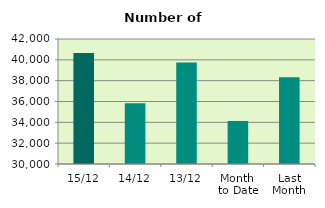
| Category | Series 0 |
|---|---|
| 15/12 | 40662 |
| 14/12 | 35826 |
| 13/12 | 39744 |
| Month 
to Date | 34132 |
| Last
Month | 38326.182 |